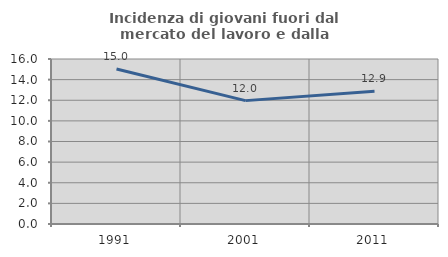
| Category | Incidenza di giovani fuori dal mercato del lavoro e dalla formazione  |
|---|---|
| 1991.0 | 15.029 |
| 2001.0 | 11.964 |
| 2011.0 | 12.864 |